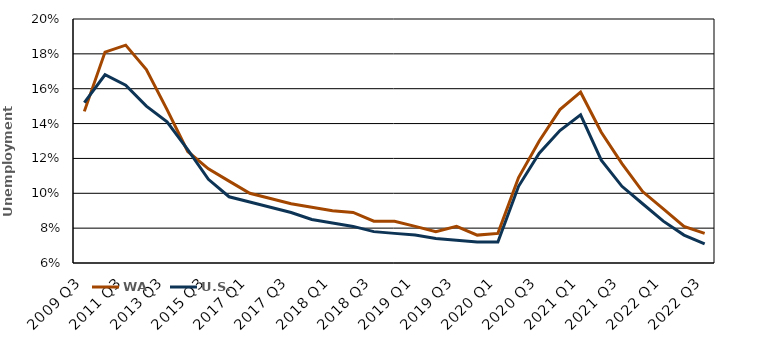
| Category | WA | U.S. |
|---|---|---|
| 2009 Q3 | 0.147 | 0.152 |
| 2010 Q3 | 0.181 | 0.168 |
| 2011 Q3 | 0.185 | 0.162 |
| 2012 Q3 | 0.171 | 0.15 |
| 2013 Q3 | 0.148 | 0.141 |
| 2014 Q3 | 0.124 | 0.125 |
| 2015 Q3 | 0.114 | 0.108 |
| 2016 Q3 | 0.107 | 0.098 |
| 2017 Q1 | 0.1 | 0.095 |
| 2017 Q2 | 0.097 | 0.092 |
| 2017 Q3 | 0.094 | 0.089 |
| 2017 Annual | 0.092 | 0.085 |
| 2018 Q1 | 0.09 | 0.083 |
| 2018 Q2 | 0.089 | 0.081 |
| 2018 Q3 | 0.084 | 0.078 |
| 2018 Annual | 0.084 | 0.077 |
| 2019 Q1 | 0.081 | 0.076 |
| 2019 Q2 | 0.078 | 0.074 |
| 2019 Q3 | 0.081 | 0.073 |
| 2019 Annual | 0.076 | 0.072 |
| 2020 Q1 | 0.077 | 0.072 |
| 2020 Q2 | 0.109 | 0.104 |
| 2020 Q3 | 0.13 | 0.123 |
| 2020 Annual | 0.148 | 0.136 |
| 2021 Q1 | 0.158 | 0.145 |
| 2021 Q2 | 0.135 | 0.119 |
| 2021 Q3 | 0.117 | 0.104 |
| 2021 Annual | 0.101 | 0.094 |
| 2022 Q1 | 0.091 | 0.084 |
| 2022 Q2 | 0.081 | 0.076 |
| 2022 Q3 | 0.077 | 0.071 |